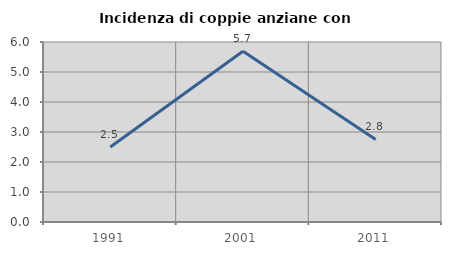
| Category | Incidenza di coppie anziane con figli |
|---|---|
| 1991.0 | 2.5 |
| 2001.0 | 5.691 |
| 2011.0 | 2.752 |